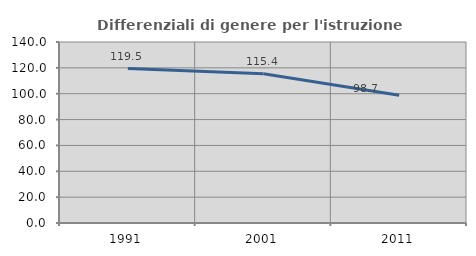
| Category | Differenziali di genere per l'istruzione superiore |
|---|---|
| 1991.0 | 119.474 |
| 2001.0 | 115.412 |
| 2011.0 | 98.749 |